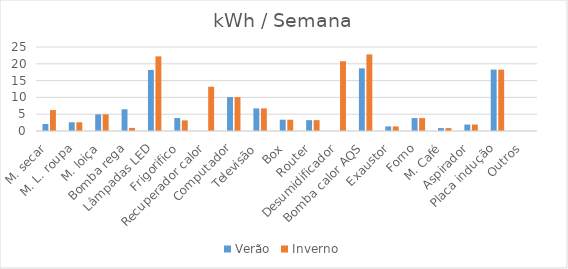
| Category | Verão | Inverno |
|---|---|---|
| M. secar | 2.077 | 6.231 |
| M. L. roupa | 2.596 | 2.596 |
| M. loiça | 4.962 | 4.962 |
| Bomba rega | 6.462 | 0.923 |
| Lâmpadas LED | 18.173 | 22.212 |
| Frigorifico | 3.861 | 3.159 |
| Recuperador calor | 0 | 13.177 |
| Computador | 10.096 | 10.096 |
| Televisão | 6.731 | 6.731 |
| Box | 3.365 | 3.365 |
| Router | 3.231 | 3.231 |
| Desumidificador | 0 | 20.769 |
| Bomba calor AQS | 18.651 | 22.796 |
| Exaustor | 1.37 | 1.37 |
| Forno | 3.846 | 3.846 |
| M. Café | 0.865 | 0.865 |
| Aspirador | 1.923 | 1.923 |
| Placa indução | 18.269 | 18.269 |
| Outros | 0 | 0 |